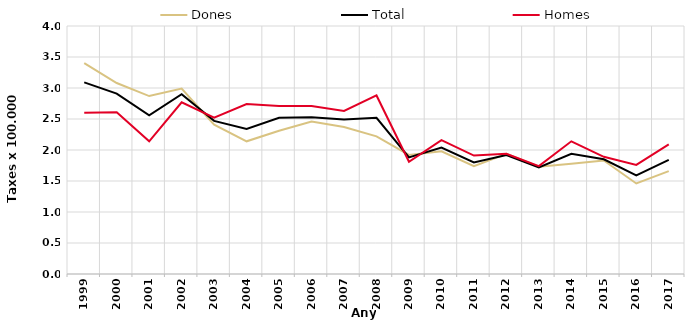
| Category | Dones | Total | Homes |
|---|---|---|---|
| 1999.0 | 3.4 | 3.09 | 2.6 |
| 2000.0 | 3.08 | 2.91 | 2.61 |
| 2001.0 | 2.87 | 2.56 | 2.14 |
| 2002.0 | 2.99 | 2.9 | 2.77 |
| 2003.0 | 2.41 | 2.47 | 2.52 |
| 2004.0 | 2.14 | 2.34 | 2.74 |
| 2005.0 | 2.31 | 2.52 | 2.71 |
| 2006.0 | 2.46 | 2.53 | 2.71 |
| 2007.0 | 2.37 | 2.49 | 2.63 |
| 2008.0 | 2.22 | 2.52 | 2.88 |
| 2009.0 | 1.92 | 1.88 | 1.81 |
| 2010.0 | 1.98 | 2.04 | 2.16 |
| 2011.0 | 1.74 | 1.8 | 1.91 |
| 2012.0 | 1.94 | 1.92 | 1.94 |
| 2013.0 | 1.73 | 1.72 | 1.74 |
| 2014.0 | 1.78 | 1.94 | 2.14 |
| 2015.0 | 1.83 | 1.85 | 1.89 |
| 2016.0 | 1.46 | 1.59 | 1.76 |
| 2017.0 | 1.66 | 1.84 | 2.09 |